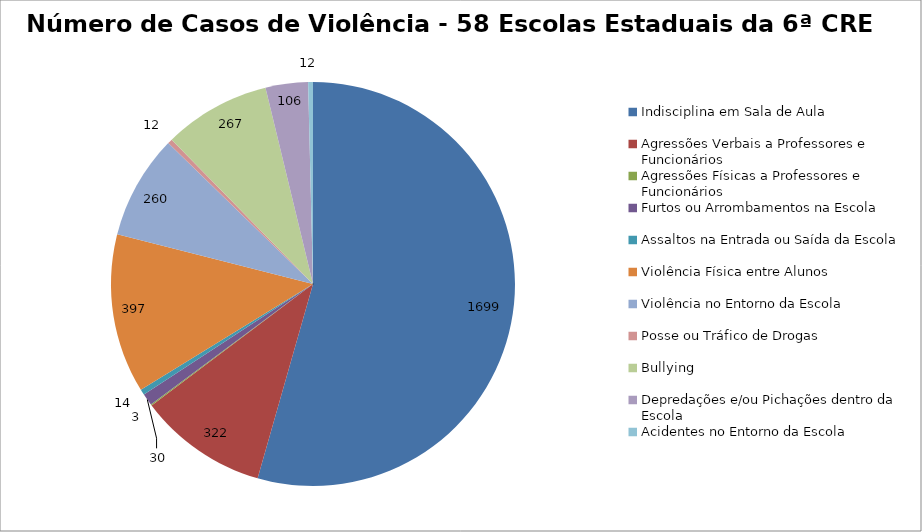
| Category | Número de Casos |
|---|---|
| Indisciplina em Sala de Aula | 1699 |
| Agressões Verbais a Professores e Funcionários | 322 |
| Agressões Físicas a Professores e Funcionários | 3 |
| Furtos ou Arrombamentos na Escola | 30 |
| Assaltos na Entrada ou Saída da Escola | 14 |
| Violência Física entre Alunos | 397 |
| Violência no Entorno da Escola | 260 |
| Posse ou Tráfico de Drogas | 12 |
| Bullying | 267 |
| Depredações e/ou Pichações dentro da Escola | 106 |
| Acidentes no Entorno da Escola | 12 |